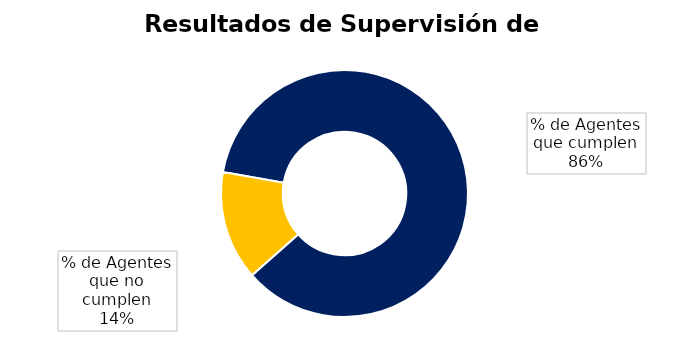
| Category | Cuenta de Departamento |
|---|---|
| % de Agentes que cumplen | 180 |
| % de Agentes que no cumplen | 30 |